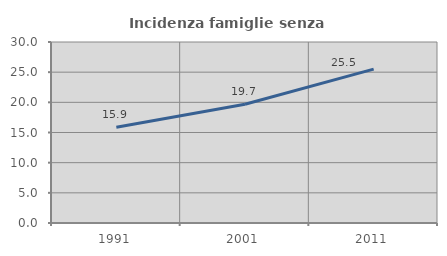
| Category | Incidenza famiglie senza nuclei |
|---|---|
| 1991.0 | 15.855 |
| 2001.0 | 19.677 |
| 2011.0 | 25.513 |